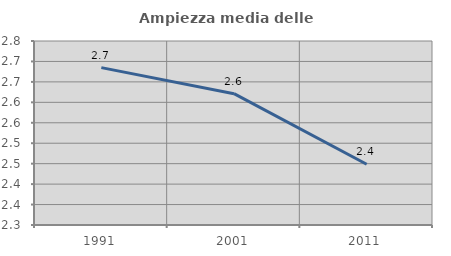
| Category | Ampiezza media delle famiglie |
|---|---|
| 1991.0 | 2.685 |
| 2001.0 | 2.621 |
| 2011.0 | 2.449 |